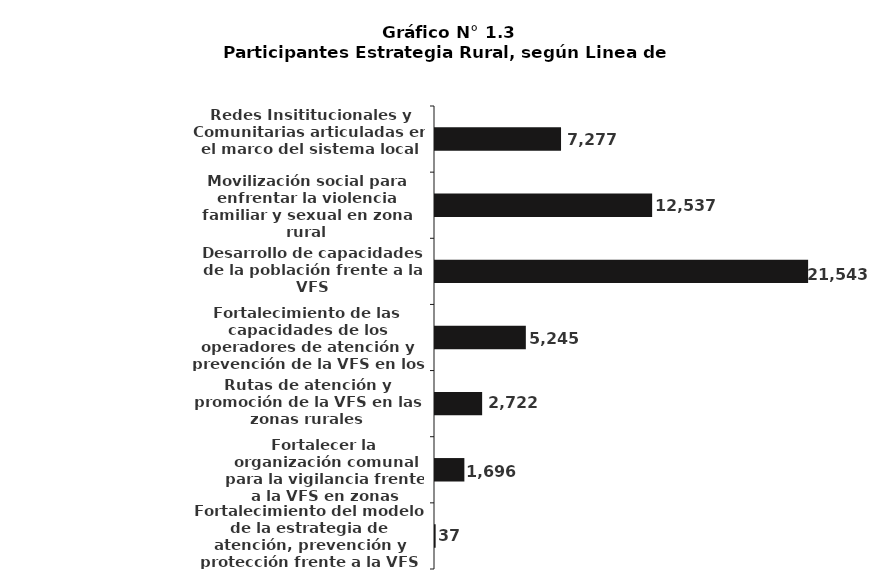
| Category | Series 0 |
|---|---|
| Redes Insititucionales y Comunitarias articuladas en el marco del sistema local | 7277 |
| Movilización social para enfrentar la violencia familiar y sexual en zona rural | 12537 |
| Desarrollo de capacidades de la población frente a la VFS | 21543 |
| Fortalecimiento de las capacidades de los operadores de atención y prevención de la VFS en los niveles provinciales, distritales y comunal | 5245 |
| Rutas de atención y promoción de la VFS en las zonas rurales | 2722 |
| Fortalecer la organización comunal para la vigilancia frente a la VFS en zonas rurales | 1696 |
| Fortalecimiento del modelo de la estrategia de atención, prevención y protección frente a la VFS en zonas rurales | 37 |